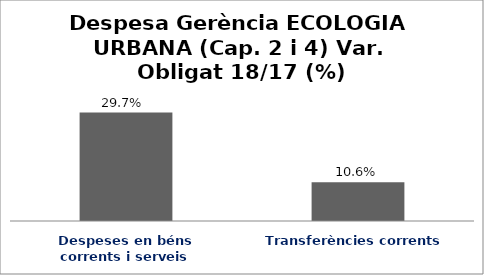
| Category | Series 0 |
|---|---|
| Despeses en béns corrents i serveis | 0.297 |
| Transferències corrents | 0.106 |